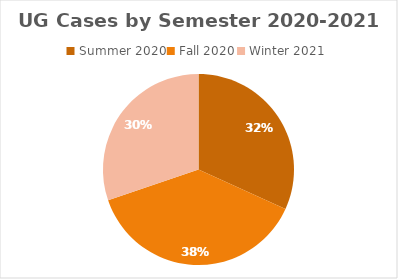
| Category | Series 0 |
|---|---|
| Summer 2020 | 82 |
| Fall 2020 | 98 |
| Winter 2021 | 78 |